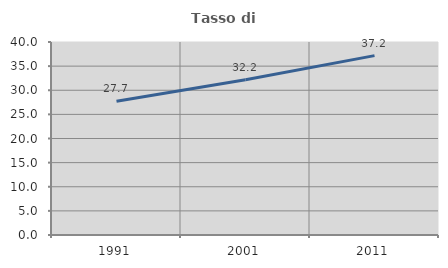
| Category | Tasso di occupazione   |
|---|---|
| 1991.0 | 27.719 |
| 2001.0 | 32.183 |
| 2011.0 | 37.179 |